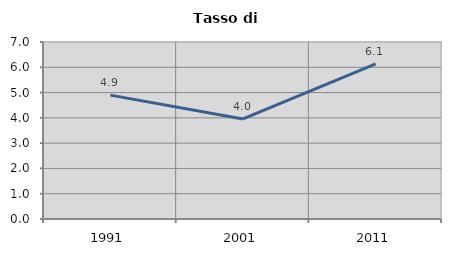
| Category | Tasso di disoccupazione   |
|---|---|
| 1991.0 | 4.898 |
| 2001.0 | 3.956 |
| 2011.0 | 6.137 |